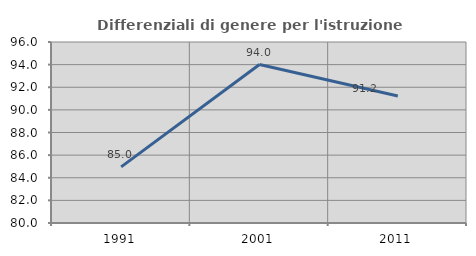
| Category | Differenziali di genere per l'istruzione superiore |
|---|---|
| 1991.0 | 84.961 |
| 2001.0 | 94.008 |
| 2011.0 | 91.234 |